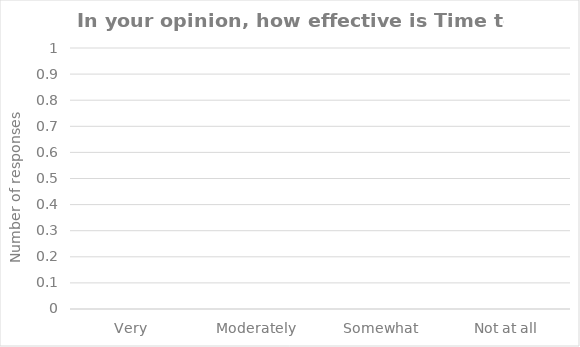
| Category | Series 0 |
|---|---|
| Very | 0 |
| Moderately | 0 |
| Somewhat | 0 |
| Not at all | 0 |